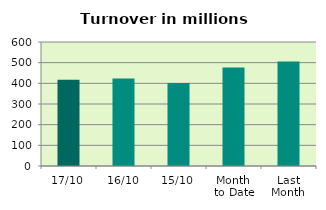
| Category | Series 0 |
|---|---|
| 17/10 | 416.782 |
| 16/10 | 422.808 |
| 15/10 | 401.923 |
| Month 
to Date | 476.651 |
| Last
Month | 505.274 |